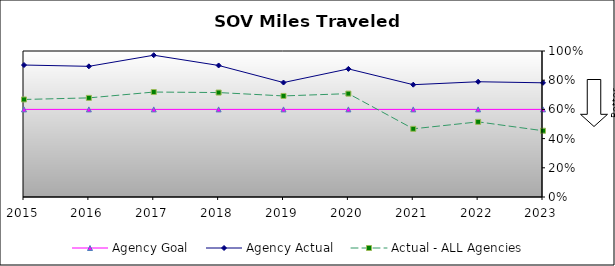
| Category | Agency Goal | Agency Actual | Actual - ALL Agencies |
|---|---|---|---|
| 2015.0 | 0.6 | 0.904 | 0.668 |
| 2016.0 | 0.6 | 0.895 | 0.679 |
| 2017.0 | 0.6 | 0.971 | 0.719 |
| 2018.0 | 0.6 | 0.901 | 0.715 |
| 2019.0 | 0.6 | 0.784 | 0.692 |
| 2020.0 | 0.6 | 0.878 | 0.708 |
| 2021.0 | 0.6 | 0.769 | 0.467 |
| 2022.0 | 0.6 | 0.789 | 0.515 |
| 2023.0 | 0.6 | 0.782 | 0.454 |